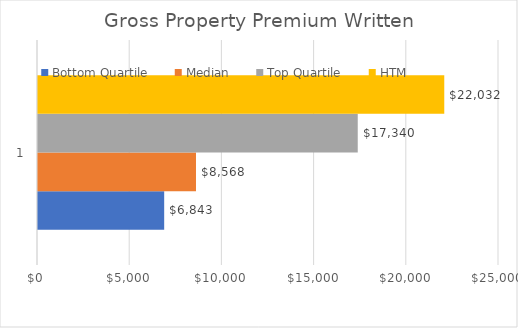
| Category | Bottom Quartile | Median | Top Quartile | HTM  |
|---|---|---|---|---|
| 0 | 6843 | 8568 | 17340 | 22032 |